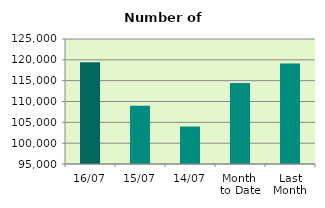
| Category | Series 0 |
|---|---|
| 16/07 | 119444 |
| 15/07 | 108998 |
| 14/07 | 103986 |
| Month 
to Date | 114467.667 |
| Last
Month | 119107.818 |